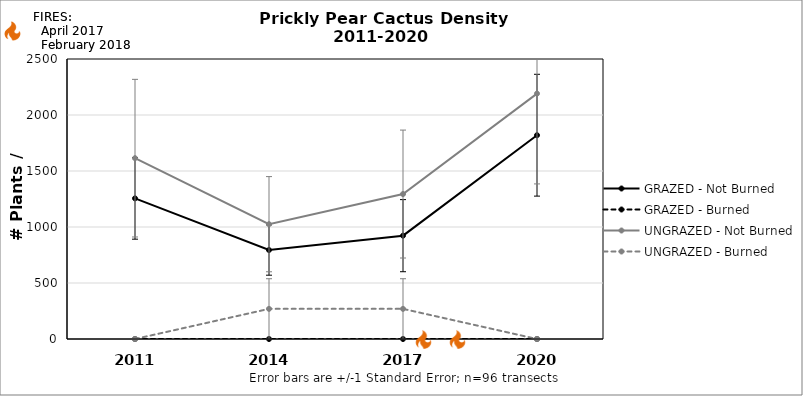
| Category | GRAZED - Not Burned | GRAZED - Burned | UNGRAZED - Not Burned | UNGRAZED - Burned |
|---|---|---|---|---|
| 2011.0 | 1255.788 | 0 | 1614.585 | 0 |
| 2014.0 | 794.478 | 0 | 1025.133 | 269.098 |
| 2017.0 | 922.62 | 0 | 1294.231 | 269.098 |
| 2020.0 | 1819.612 | 0 | 2191.222 | 0 |